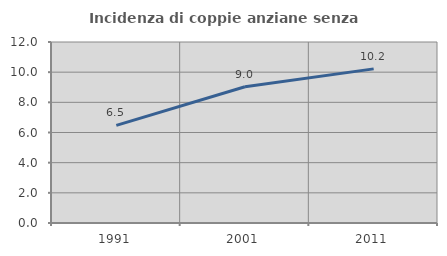
| Category | Incidenza di coppie anziane senza figli  |
|---|---|
| 1991.0 | 6.473 |
| 2001.0 | 9.035 |
| 2011.0 | 10.218 |